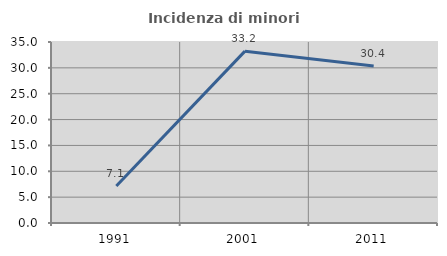
| Category | Incidenza di minori stranieri |
|---|---|
| 1991.0 | 7.143 |
| 2001.0 | 33.234 |
| 2011.0 | 30.373 |